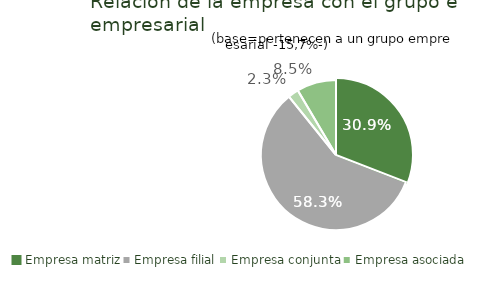
| Category | Series 0 |
|---|---|
| Empresa matriz | 0.309 |
| Empresa filial | 0.583 |
| Empresa conjunta | 0.023 |
| Empresa asociada | 0.085 |